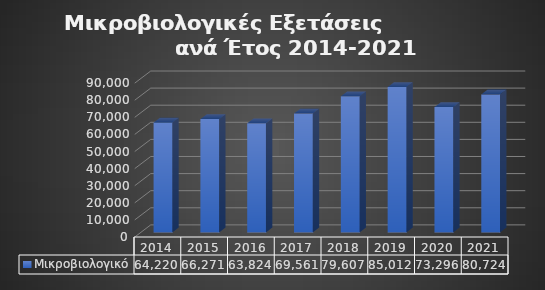
| Category | Μικροβιολογικό  |
|---|---|
| 2014.0 | 64220 |
| 2015.0 | 66271 |
| 2016.0 | 63824 |
| 2017.0 | 69561 |
| 2018.0 | 79607 |
| 2019.0 | 85012 |
| 2020.0 | 73296 |
| 2021.0 | 80724 |